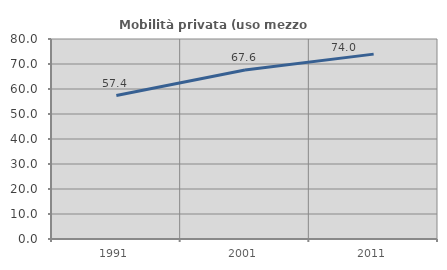
| Category | Mobilità privata (uso mezzo privato) |
|---|---|
| 1991.0 | 57.375 |
| 2001.0 | 67.572 |
| 2011.0 | 73.952 |